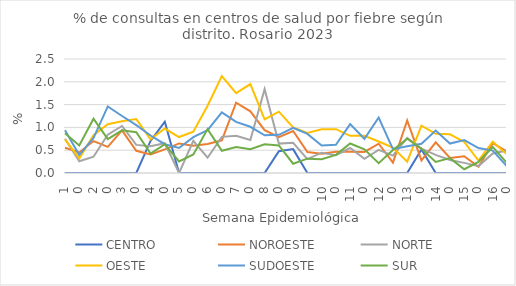
| Category | CENTRO | NOROESTE | NORTE | OESTE | SUDOESTE | SUR |
|---|---|---|---|---|---|---|
| 0 | 0 | 0.554 | 0.753 | 0.738 | 0.94 | 0.873 |
| 1 | 0 | 0.451 | 0.258 | 0.319 | 0.393 | 0.605 |
| 2 | 0 | 0.7 | 0.356 | 0.829 | 0.771 | 1.189 |
| 3 | 0 | 0.574 | 0.84 | 1.071 | 1.459 | 0.743 |
| 4 | 0 | 0.934 | 1.031 | 1.134 | 1.25 | 0.935 |
| 5 | 0 | 0.487 | 0.616 | 1.183 | 1.051 | 0.893 |
| 6 | 0.704 | 0.408 | 0.585 | 0.74 | 0.823 | 0.426 |
| 7 | 1.124 | 0.518 | 0.652 | 0.975 | 0.632 | 0.63 |
| 8 | 0 | 0.649 | 0 | 0.789 | 0.548 | 0.255 |
| 9 | 0 | 0.598 | 0.704 | 0.907 | 0.787 | 0.408 |
| 10 | 0 | 0.638 | 0.335 | 1.474 | 0.939 | 0.962 |
| 11 | 0 | 0.717 | 0.792 | 2.127 | 1.33 | 0.487 |
| 12 | 0 | 1.543 | 0.818 | 1.75 | 1.12 | 0.571 |
| 13 | 0 | 1.353 | 0.725 | 1.951 | 1.014 | 0.52 |
| 14 | 0 | 0.939 | 1.838 | 1.175 | 0.827 | 0.631 |
| 15 | 0.478 | 0.784 | 0.644 | 1.344 | 0.837 | 0.605 |
| 16 | 0.524 | 0.921 | 0.663 | 0.998 | 0.99 | 0.204 |
| 17 | 0 | 0.46 | 0.305 | 0.879 | 0.857 | 0.315 |
| 18 | 0 | 0.422 | 0.445 | 0.958 | 0.604 | 0.301 |
| 19 | 0 | 0.464 | 0.39 | 0.96 | 0.619 | 0.398 |
| 20 | 0 | 0.467 | 0.548 | 0.814 | 1.071 | 0.648 |
| 21 | 0 | 0.461 | 0.313 | 0.818 | 0.75 | 0.52 |
| 22 | 0 | 0.642 | 0.506 | 0.692 | 1.217 | 0.215 |
| 23 | 0 | 0.226 | 0.38 | 0.556 | 0.523 | 0.506 |
| 24 | 0 | 1.151 | 0.771 | 0.25 | 0.587 | 0.753 |
| 25 | 0.518 | 0.276 | 0.534 | 1.039 | 0.641 | 0.532 |
| 26 | 0 | 0.671 | 0.397 | 0.86 | 0.932 | 0.242 |
| 27 | 0 | 0.329 | 0.286 | 0.849 | 0.646 | 0.327 |
| 28 | 0 | 0.367 | 0.222 | 0.681 | 0.72 | 0.083 |
| 29 | 0 | 0.136 | 0.151 | 0.272 | 0.546 | 0.245 |
| 30 | 0 | 0.652 | 0.429 | 0.686 | 0.492 | 0.571 |
| 31 | 0 | 0.472 | 0.495 | 0.409 | 0.144 | 0.216 |